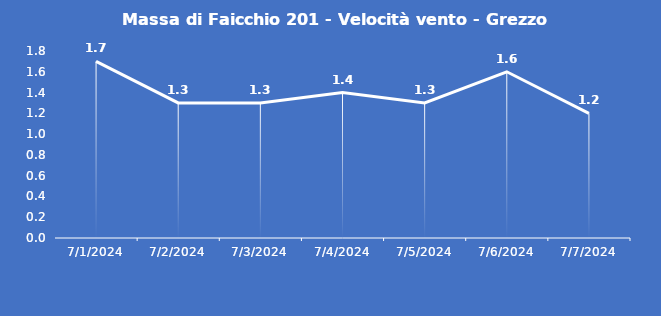
| Category | Massa di Faicchio 201 - Velocità vento - Grezzo (m/s) |
|---|---|
| 7/1/24 | 1.7 |
| 7/2/24 | 1.3 |
| 7/3/24 | 1.3 |
| 7/4/24 | 1.4 |
| 7/5/24 | 1.3 |
| 7/6/24 | 1.6 |
| 7/7/24 | 1.2 |